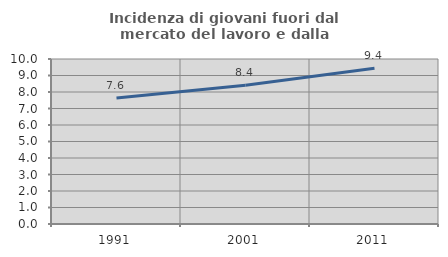
| Category | Incidenza di giovani fuori dal mercato del lavoro e dalla formazione  |
|---|---|
| 1991.0 | 7.636 |
| 2001.0 | 8.406 |
| 2011.0 | 9.441 |